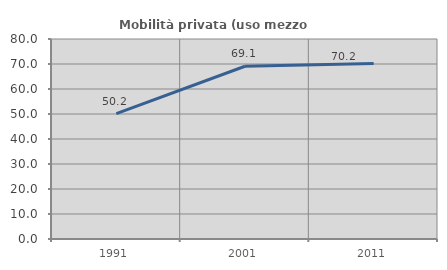
| Category | Mobilità privata (uso mezzo privato) |
|---|---|
| 1991.0 | 50.163 |
| 2001.0 | 69.11 |
| 2011.0 | 70.216 |